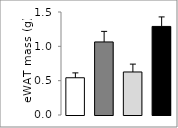
| Category | Series 0 |
|---|---|
| 0 | 0.542 |
| 1 | 1.064 |
| 2 | 0.627 |
| 3 | 1.29 |